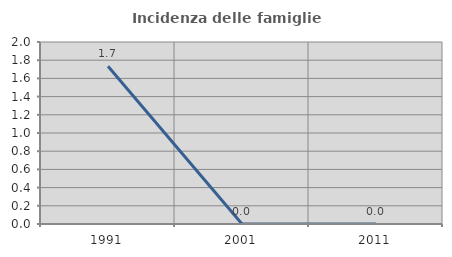
| Category | Incidenza delle famiglie numerose |
|---|---|
| 1991.0 | 1.734 |
| 2001.0 | 0 |
| 2011.0 | 0 |